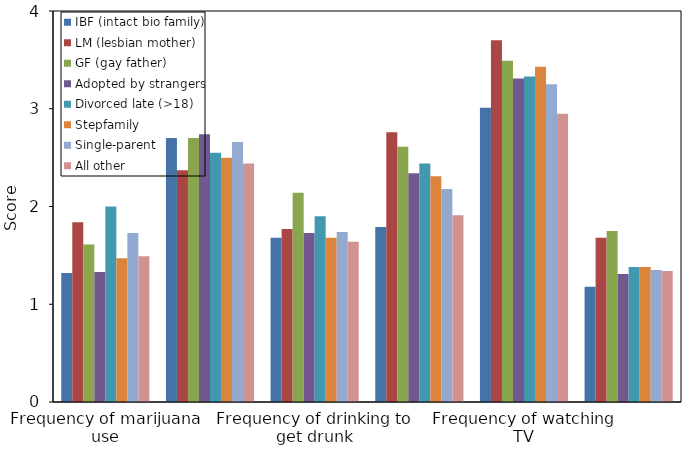
| Category | IBF (intact bio family) | LM (lesbian mother) | GF (gay father) | Adopted by strangers | Divorced late (>18) | Stepfamily | Single-parent | All other |
|---|---|---|---|---|---|---|---|---|
| Frequency of marijuana use | 1.32 | 1.84 | 1.61 | 1.33 | 2 | 1.47 | 1.73 | 1.49 |
| Frequency of alcohol use | 2.7 | 2.37 | 2.7 | 2.74 | 2.55 | 2.5 | 2.66 | 2.44 |
| Frequency of drinking to get drunk | 1.68 | 1.77 | 2.14 | 1.73 | 1.9 | 1.68 | 1.74 | 1.64 |
| Frequency of smoking | 1.79 | 2.76 | 2.61 | 2.34 | 2.44 | 2.31 | 2.18 | 1.91 |
| Frequency of watching TV | 3.01 | 3.7 | 3.49 | 3.31 | 3.33 | 3.43 | 3.25 | 2.95 |
| Frequency of having been arrested | 1.18 | 1.68 | 1.75 | 1.31 | 1.38 | 1.38 | 1.35 | 1.34 |